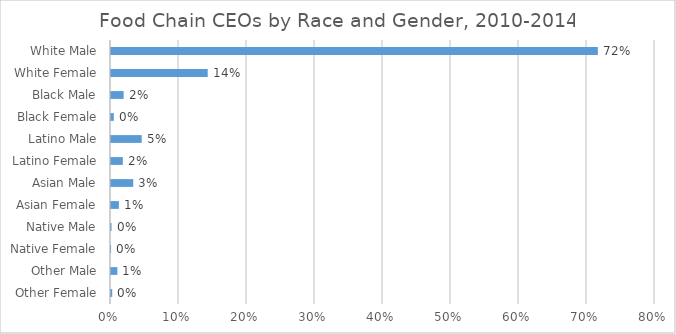
| Category | Series 0 |
|---|---|
| Other Female | 0.002 |
| Other Male | 0.009 |
| Native Female | 0 |
| Native Male | 0.001 |
| Asian Female | 0.012 |
| Asian Male | 0.033 |
| Latino Female | 0.017 |
| Latino Male | 0.045 |
| Black Female | 0.004 |
| Black Male | 0.019 |
| White Female | 0.142 |
| White Male | 0.716 |